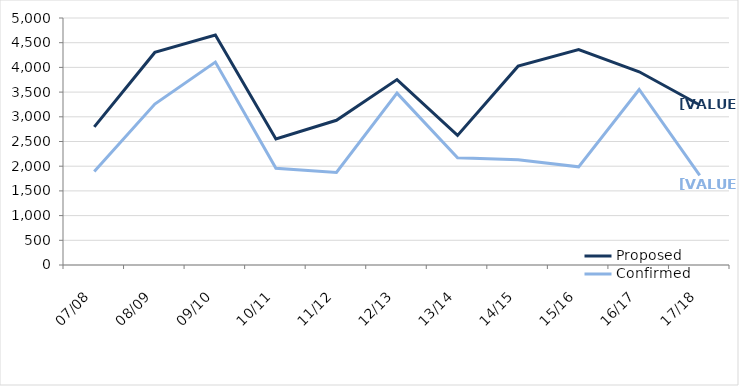
| Category | Proposed | Confirmed |
|---|---|---|
| 07/08 | 2797 | 1893 |
| 08/09 | 4303 | 3258 |
| 09/10 | 4654 | 4108 |
| 10/11 | 2553 | 1958 |
| 11/12 | 2930 | 1872 |
| 12/13 | 3753 | 3479 |
| 13/14 | 2623 | 2171 |
| 14/15 | 4025 | 2131 |
| 15/16 | 4360 | 1987 |
| 16/17 | 3911 | 3553 |
| 17/18 | 3239 | 1815 |